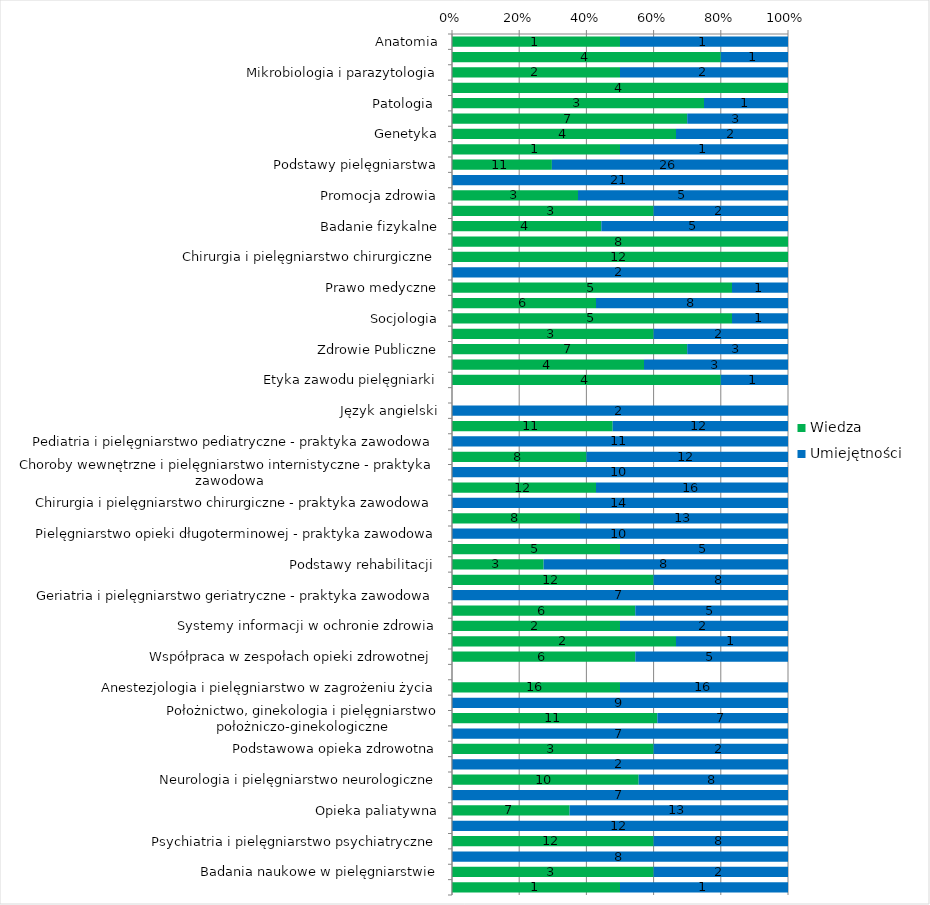
| Category | Wiedza | Umiejętności |
|---|---|---|
| Anatomia | 1 | 1 |
| Biochemia i biofizyka | 4 | 1 |
| Mikrobiologia i parazytologia | 2 | 2 |
| Fizjologia | 4 | 0 |
| Patologia  | 3 | 1 |
| Farmakologia | 7 | 3 |
| Genetyka | 4 | 2 |
| Radiologia | 1 | 1 |
| Podstawy pielęgniarstwa | 11 | 26 |
| Podstawy pielęgniarstwa - praktyka zawodowa | 0 | 21 |
| Promocja zdrowia | 3 | 5 |
| Zakażenia szpitalne | 3 | 2 |
| Badanie fizykalne | 4 | 5 |
| Choroby wewnętrzne i pielęgniarstwo internistyczne | 8 | 0 |
| Chirurgia i pielęgniarstwo chirurgiczne | 12 | 0 |
| Język angielski | 0 | 2 |
| Prawo medyczne | 5 | 1 |
| Psychologia | 6 | 8 |
| Socjologia | 5 | 1 |
| Pedagogika | 3 | 2 |
| Zdrowie Publiczne | 7 | 3 |
| Dietetyka | 4 | 3 |
| Etyka zawodu pielęgniarki | 4 | 1 |
| Przedmiot | 0 | 0 |
| Język angielski | 0 | 2 |
| Pediatria i pielęgniarstwo pediatryczne | 11 | 12 |
| Pediatria i pielęgniarstwo pediatryczne - praktyka zawodowa | 0 | 11 |
| Choroby wewnętrzne i pielęgniarstwo internistyczne | 8 | 12 |
| Choroby wewnętrzne i pielęgniarstwo internistyczne - praktyka zawodowa | 0 | 10 |
| Chirurgia i pielęgniarstwo chirurgiczne | 12 | 16 |
| Chirurgia i pielęgniarstwo chirurgiczne - praktyka zawodowa | 0 | 14 |
| Pielęgniarstwo opieki długoterminowej | 8 | 13 |
| Pielęgniarstwo opieki długoterminowej - praktyka zawodowa | 0 | 10 |
| Podstawy ratownictwa medycznego | 5 | 5 |
| Podstawy rehabilitacji  | 3 | 8 |
| Geriatria i pielęgniarstwo geriatryczne | 12 | 8 |
| Geriatria i pielęgniarstwo geriatryczne - praktyka zawodowa | 0 | 7 |
| Organizacja pracy pielęgniarskiej | 6 | 5 |
| Systemy informacji w ochronie zdrowia | 2 | 2 |
| Język migowy | 2 | 1 |
| Współpraca w zespołach opieki zdrowotnej  | 6 | 5 |
| Przedmiot | 0 | 0 |
| Anestezjologia i pielęgniarstwo w zagrożeniu życia | 16 | 16 |
| Anestezjologia i pielęgniarstwo w zagrożeniu życia - praktyka zawodowa | 0 | 9 |
| Położnictwo, ginekologia i pielęgniarstwo położniczo-ginekologiczne | 11 | 7 |
| Położnictwo, ginekologia i pielęgniarstwo położniczo-ginekologiczne - praktyka zawodowa | 0 | 7 |
| Podstawowa opieka zdrowotna | 3 | 2 |
| Podstawowa opieka zdrowotna - praktyka zawodowa | 0 | 2 |
| Neurologia i pielęgniarstwo neurologiczne | 10 | 8 |
| Neurologia i pielęgniarstwo neurologiczne - praktyka zawodowa | 0 | 7 |
| Opieka paliatywna | 7 | 13 |
| Opieka paliatywna - praktyka zawodowa | 0 | 12 |
| Psychiatria i pielęgniarstwo psychiatryczne | 12 | 8 |
| Psychiatria i pielęgniarstwo psychiatryczne - praktyka zawodowa | 0 | 8 |
| Badania naukowe w pielęgniarstwie | 3 | 2 |
| Seminarium dyplomowe | 1 | 1 |